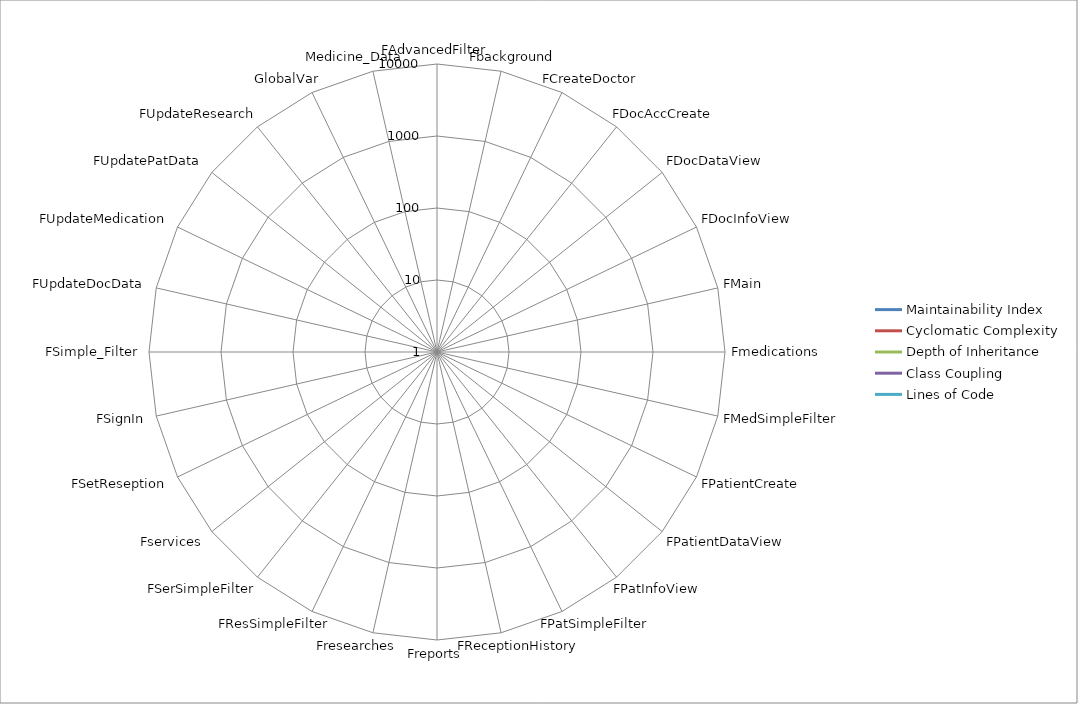
| Category | Maintainability Index | Cyclomatic Complexity | Depth of Inheritance | Class Coupling | Lines of Code |
|---|---|---|---|---|---|
| FAdvancedFilter | 36 | 76 | 7 | 38 | 312 |
| Fbackground | 68 | 9 | 7 | 17 | 33 |
| FCreateDoctor | 45 | 24 | 7 | 40 | 318 |
| FDocAccCreate | 53 | 13 | 7 | 22 | 113 |
| FDocDataView | 51 | 89 | 7 | 77 | 451 |
| FDocInfoView | 52 | 12 | 7 | 48 | 130 |
| FMain | 21 | 2847 | 7 | 122 | 3363 |
| Fmedications | 50 | 77 | 7 | 67 | 438 |
| FMedSimpleFilter | 47 | 15 | 7 | 32 | 205 |
| FPatientCreate | 46 | 21 | 7 | 37 | 250 |
| FPatientDataView | 52 | 79 | 7 | 83 | 377 |
| FPatInfoView | 57 | 17 | 7 | 56 | 124 |
| FPatSimpleFilter | 45 | 14 | 7 | 34 | 200 |
| FReceptionHistory | 40 | 123 | 7 | 117 | 1063 |
| Freports | 49 | 17 | 7 | 51 | 100 |
| Fresearches | 50 | 76 | 7 | 68 | 440 |
| FResSimpleFilter | 43 | 14 | 7 | 33 | 232 |
| FSerSimpleFilter | 48 | 12 | 7 | 32 | 156 |
| Fservices | 50 | 75 | 7 | 67 | 416 |
| FSetReseption | 50 | 22 | 7 | 65 | 290 |
| FSignIn | 57 | 12 | 7 | 25 | 100 |
| FSimple_Filter | 39 | 33 | 7 | 45 | 556 |
| FUpdateDocData | 44 | 42 | 7 | 26 | 273 |
| FUpdateMedication | 54 | 14 | 7 | 21 | 112 |
| FUpdatePatData | 48 | 32 | 7 | 21 | 199 |
| FUpdateResearch | 54 | 15 | 7 | 21 | 120 |
| GlobalVar | 58 | 68 | 1 | 36 | 162 |
| Medicine_Data | 55 | 117 | 2 | 107 | 1123 |